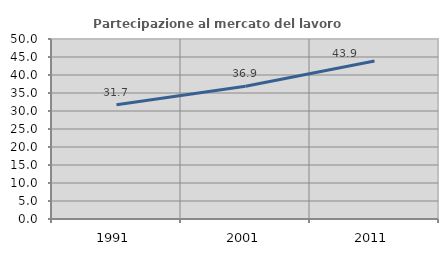
| Category | Partecipazione al mercato del lavoro  femminile |
|---|---|
| 1991.0 | 31.729 |
| 2001.0 | 36.875 |
| 2011.0 | 43.912 |